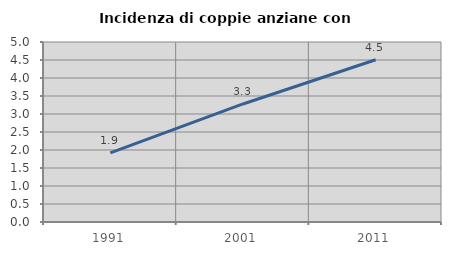
| Category | Incidenza di coppie anziane con figli |
|---|---|
| 1991.0 | 1.921 |
| 2001.0 | 3.279 |
| 2011.0 | 4.508 |